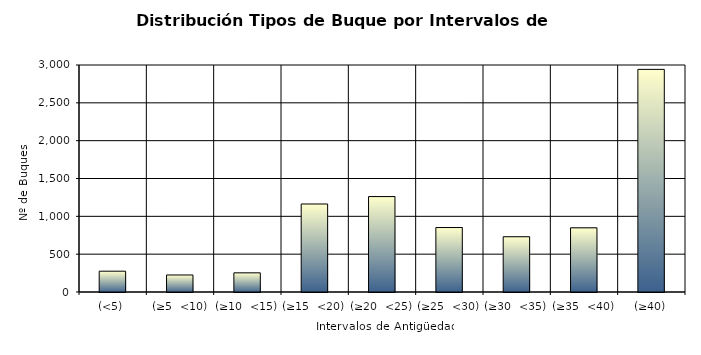
| Category | Series 0 |
|---|---|
| (<5) | 275 |
| (≥5  <10) | 225 |
| (≥10  <15) | 253 |
| (≥15  <20) | 1163 |
| (≥20  <25) | 1261 |
| (≥25  <30) | 852 |
| (≥30  <35) | 730 |
| (≥35  <40) | 848 |
| (≥40) | 2942 |